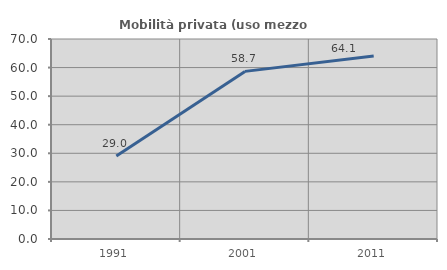
| Category | Mobilità privata (uso mezzo privato) |
|---|---|
| 1991.0 | 29.016 |
| 2001.0 | 58.667 |
| 2011.0 | 64.078 |